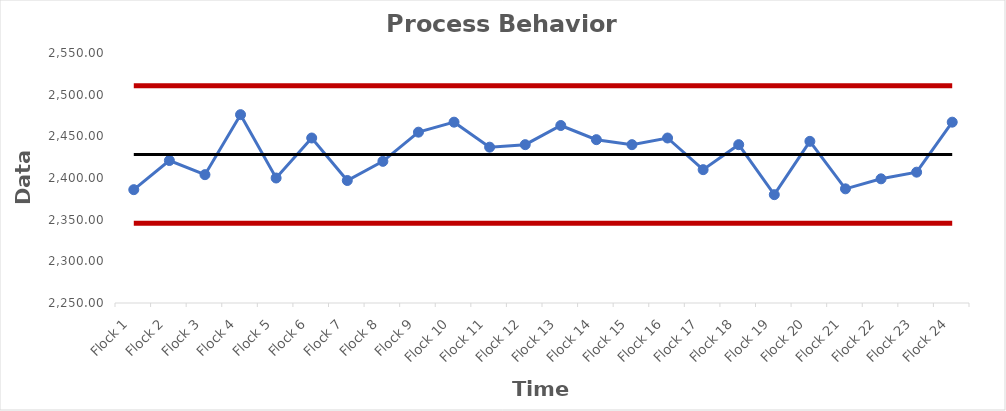
| Category |  Final BW data  |  Average BW  |  Lower Control Limit  |  Upper Control Limit  |
|---|---|---|---|---|
| Flock 1 | 2386 | 2428.152 | 2345.574 | 2510.73 |
| Flock 2 | 2421 | 2428.152 | 2345.574 | 2510.73 |
| Flock 3 | 2404 | 2428.152 | 2345.574 | 2510.73 |
| Flock 4 | 2476 | 2428.152 | 2345.574 | 2510.73 |
| Flock 5 | 2400 | 2428.152 | 2345.574 | 2510.73 |
| Flock 6 | 2448 | 2428.152 | 2345.574 | 2510.73 |
| Flock 7 | 2397 | 2428.152 | 2345.574 | 2510.73 |
| Flock 8 | 2420 | 2428.152 | 2345.574 | 2510.73 |
| Flock 9 | 2455 | 2428.152 | 2345.574 | 2510.73 |
| Flock 10 | 2467 | 2428.152 | 2345.574 | 2510.73 |
| Flock 11 | 2437 | 2428.152 | 2345.574 | 2510.73 |
| Flock 12 | 2440 | 2428.152 | 2345.574 | 2510.73 |
| Flock 13 | 2463 | 2428.152 | 2345.574 | 2510.73 |
| Flock 14 | 2446 | 2428.152 | 2345.574 | 2510.73 |
| Flock 15 | 2440 | 2428.152 | 2345.574 | 2510.73 |
| Flock 16 | 2448 | 2428.152 | 2345.574 | 2510.73 |
| Flock 17 | 2410 | 2428.152 | 2345.574 | 2510.73 |
| Flock 18 | 2440 | 2428.152 | 2345.574 | 2510.73 |
| Flock 19 | 2380 | 2428.152 | 2345.574 | 2510.73 |
| Flock 20 | 2444 | 2428.152 | 2345.574 | 2510.73 |
| Flock 21 | 2387 | 2428.152 | 2345.574 | 2510.73 |
| Flock 22 | 2399 | 2428.152 | 2345.574 | 2510.73 |
| Flock 23 | 2407 | 2428.152 | 2345.574 | 2510.73 |
| Flock 24 | 2467 | 2428.152 | 2345.574 | 2510.73 |